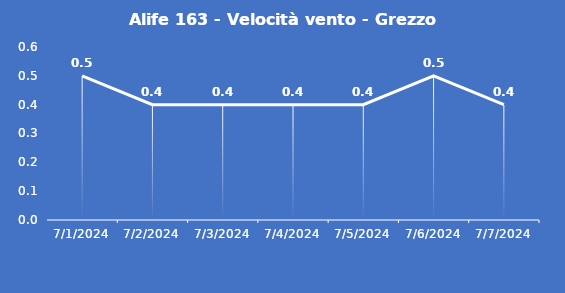
| Category | Alife 163 - Velocità vento - Grezzo (m/s) |
|---|---|
| 7/1/24 | 0.5 |
| 7/2/24 | 0.4 |
| 7/3/24 | 0.4 |
| 7/4/24 | 0.4 |
| 7/5/24 | 0.4 |
| 7/6/24 | 0.5 |
| 7/7/24 | 0.4 |